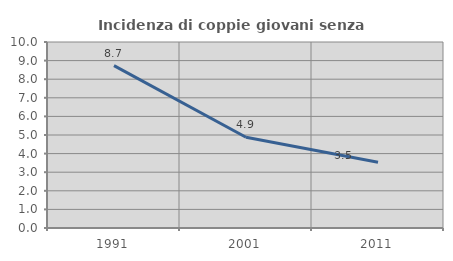
| Category | Incidenza di coppie giovani senza figli |
|---|---|
| 1991.0 | 8.73 |
| 2001.0 | 4.878 |
| 2011.0 | 3.533 |